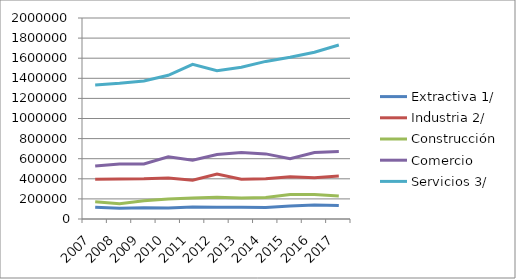
| Category | Extractiva 1/ | Industria 2/ | Construcción | Comercio | Servicios 3/ |
|---|---|---|---|---|---|
| 2007.0 | 117584 | 396017 | 172734 | 527595 | 1334339 |
| 2008.0 | 106105 | 398253 | 152178 | 548064 | 1350337 |
| 2009.0 | 113026 | 399520 | 182649 | 546766 | 1373619 |
| 2010.0 | 108944 | 407646 | 199438 | 618898 | 1429714 |
| 2011.0 | 118409 | 385044 | 208630 | 584233 | 1538399 |
| 2012.0 | 116794 | 446889 | 215922 | 641970 | 1474411 |
| 2013.0 | 115988 | 395978 | 209956 | 661716 | 1509512 |
| 2014.0 | 113437 | 399353 | 214232 | 647853 | 1568050 |
| 2015.0 | 130003 | 421208 | 243259 | 599194 | 1609727 |
| 2016.0 | 138326 | 410966 | 244519 | 661914 | 1659319 |
| 2017.0 | 133816 | 428335 | 229032 | 670456 | 1731786 |